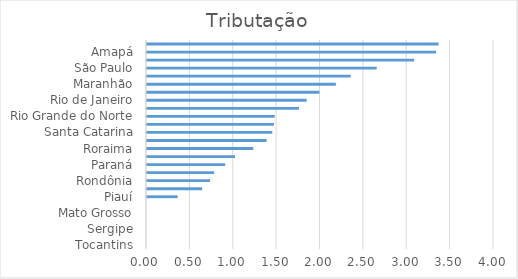
| Category | Dimensão 2 |
|---|---|
| Tocantins | 0 |
| Alagoas | 0 |
| Sergipe | 0 |
| Mato Grosso do Sul | 0 |
| Mato Grosso | 0 |
| Goiás | 0 |
| Piauí | 0.353 |
| Pernambuco | 0.636 |
| Rondônia | 0.727 |
| Rio Grande do Sul | 0.775 |
| Paraná | 0.902 |
| Minas Gerais | 1.014 |
| Roraima | 1.225 |
| Paraíba | 1.378 |
| Santa Catarina | 1.444 |
| Amazonas | 1.463 |
| Rio Grande do Norte | 1.472 |
| Bahia | 1.752 |
| Rio de Janeiro | 1.84 |
| Acre | 1.987 |
| Maranhão | 2.177 |
| Espírito Santo | 2.348 |
| São Paulo | 2.648 |
| Pará | 3.08 |
| Amapá | 3.333 |
| Ceará | 3.362 |